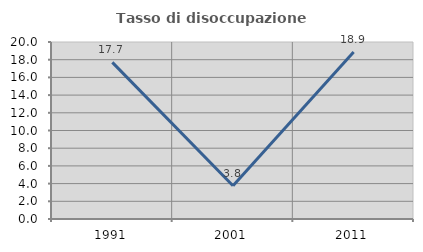
| Category | Tasso di disoccupazione giovanile  |
|---|---|
| 1991.0 | 17.699 |
| 2001.0 | 3.75 |
| 2011.0 | 18.868 |